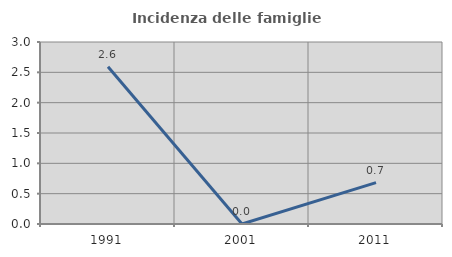
| Category | Incidenza delle famiglie numerose |
|---|---|
| 1991.0 | 2.591 |
| 2001.0 | 0 |
| 2011.0 | 0.683 |